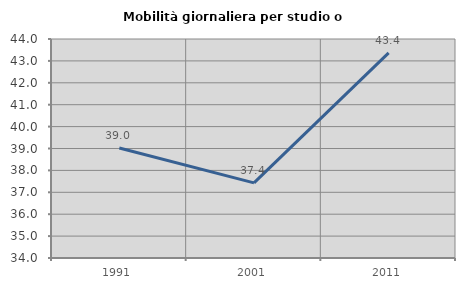
| Category | Mobilità giornaliera per studio o lavoro |
|---|---|
| 1991.0 | 39.022 |
| 2001.0 | 37.43 |
| 2011.0 | 43.368 |